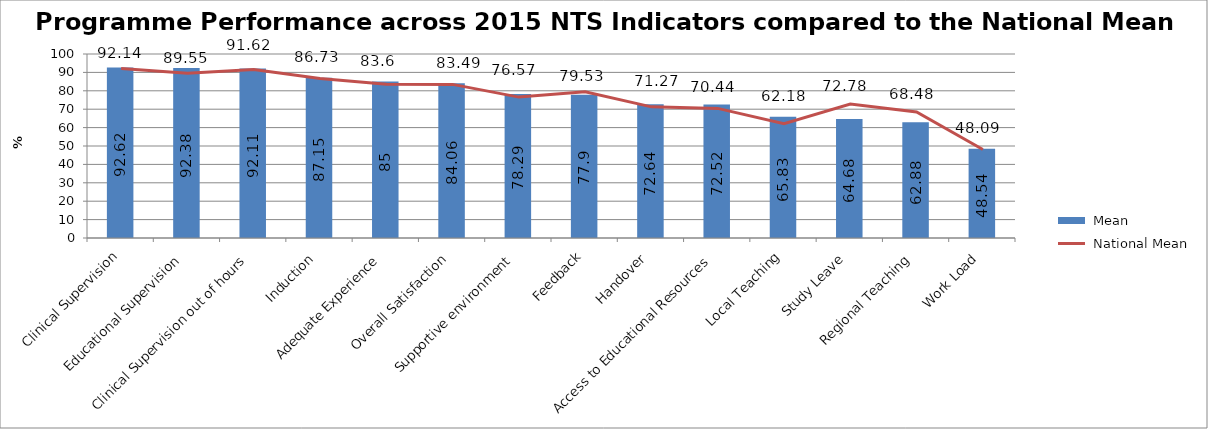
| Category |  Mean |
|---|---|
| Clinical Supervision | 92.62 |
| Educational Supervision | 92.38 |
| Clinical Supervision out of hours | 92.11 |
| Induction | 87.15 |
| Adequate Experience | 85 |
| Overall Satisfaction | 84.06 |
| Supportive environment | 78.29 |
| Feedback | 77.9 |
| Handover | 72.64 |
| Access to Educational Resources | 72.52 |
| Local Teaching | 65.83 |
| Study Leave | 64.68 |
| Regional Teaching | 62.88 |
| Work Load | 48.54 |